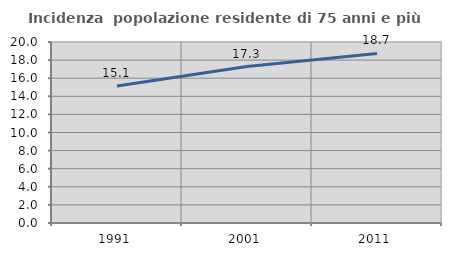
| Category | Incidenza  popolazione residente di 75 anni e più |
|---|---|
| 1991.0 | 15.136 |
| 2001.0 | 17.291 |
| 2011.0 | 18.738 |